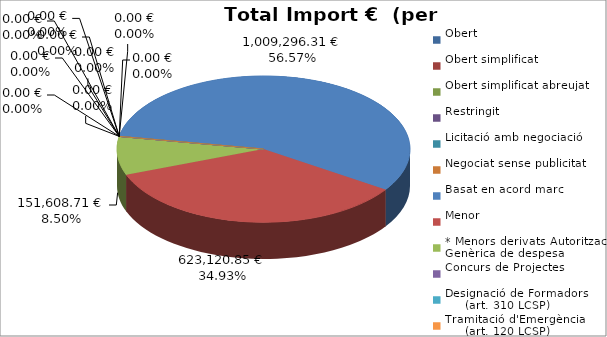
| Category | Total preu
(amb IVA) |
|---|---|
| Obert | 0 |
| Obert simplificat | 0 |
| Obert simplificat abreujat | 0 |
| Restringit | 0 |
| Licitació amb negociació | 0 |
| Negociat sense publicitat | 0 |
| Basat en acord marc | 1009296.31 |
| Menor | 623120.85 |
| * Menors derivats Autorització Genèrica de despesa | 151608.71 |
| Concurs de Projectes | 0 |
| Designació de Formadors
     (art. 310 LCSP) | 0 |
| Tramitació d'Emergència
     (art. 120 LCSP) | 0 |